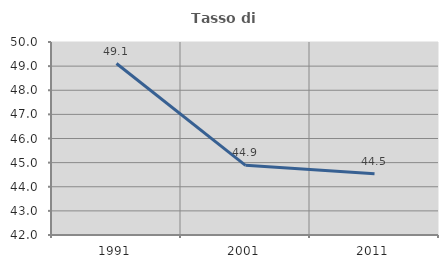
| Category | Tasso di occupazione   |
|---|---|
| 1991.0 | 49.108 |
| 2001.0 | 44.888 |
| 2011.0 | 44.536 |